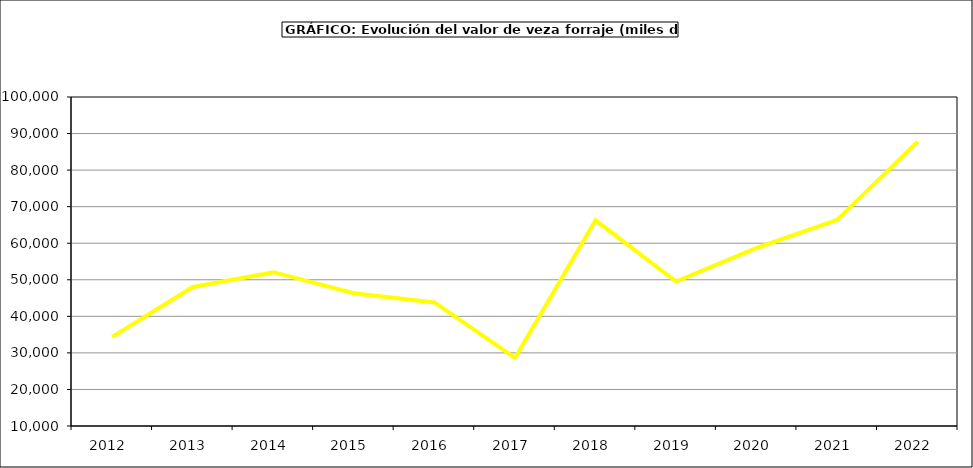
| Category | Valor |
|---|---|
| 2012.0 | 34393.555 |
| 2013.0 | 48025.512 |
| 2014.0 | 52077.137 |
| 2015.0 | 46338 |
| 2016.0 | 43806 |
| 2017.0 | 28604.284 |
| 2018.0 | 66265.658 |
| 2019.0 | 49524.023 |
| 2020.0 | 58696.539 |
| 2021.0 | 66399.157 |
| 2022.0 | 87781.977 |